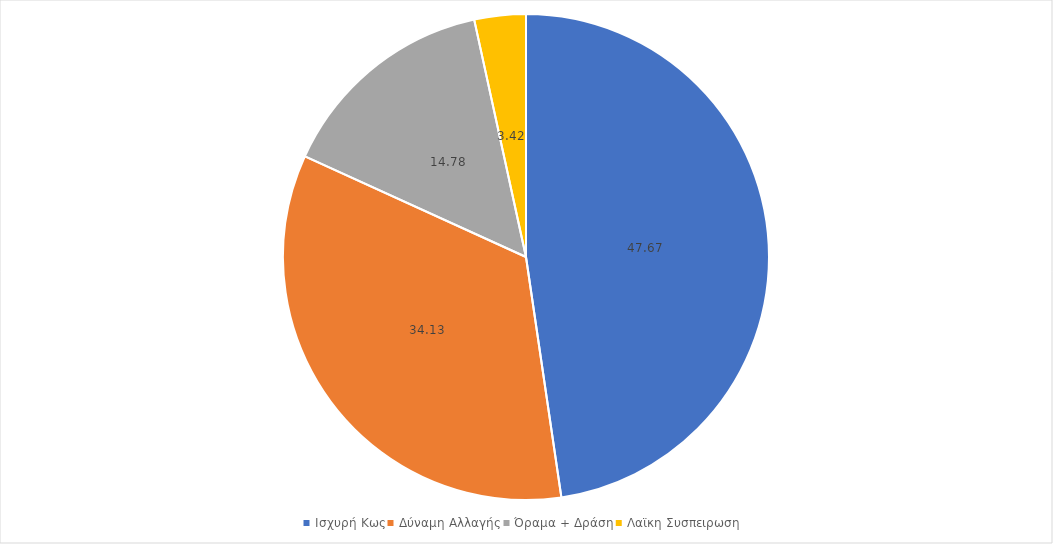
| Category | Series 0 |
|---|---|
| Ισχυρή Κως | 47.674 |
| Δύναμη Αλλαγής | 34.126 |
| Όραμα + Δράση | 14.779 |
| Λαϊκη Συσπειρωση | 3.421 |